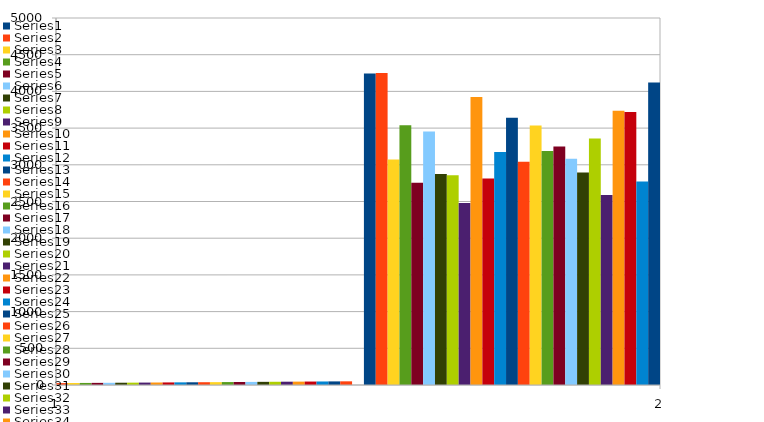
| Category | Series 0 | Series 1 | Series 2 | Series 3 | Series 4 | Series 5 | Series 6 | Series 7 | Series 8 | Series 9 | Series 10 | Series 11 | Series 12 | Series 13 | Series 14 | Series 15 | Series 16 | Series 17 | Series 18 | Series 19 | Series 20 | Series 21 | Series 22 | Series 23 | Series 24 | Series 25 | Series 26 | Series 27 | Series 28 | Series 29 | Series 30 | Series 31 | Series 32 | Series 33 | Series 34 | Series 35 | Series 36 | Series 37 | Series 38 | Series 39 | Series 40 | Series 41 | Series 42 | Series 43 | Series 44 | Series 45 | Series 46 | Series 47 | Series 48 | Series 49 |
|---|---|---|---|---|---|---|---|---|---|---|---|---|---|---|---|---|---|---|---|---|---|---|---|---|---|---|---|---|---|---|---|---|---|---|---|---|---|---|---|---|---|---|---|---|---|---|---|---|---|---|
| 0 | 1 | 2 | 3 | 4 | 5 | 6 | 7 | 8 | 9 | 10 | 11 | 12 | 13 | 14 | 15 | 16 | 17 | 18 | 19 | 20 | 21 | 22 | 23 | 24 | 25 | 26 | 27 | 28 | 29 | 30 | 31 | 32 | 33 | 34 | 35 | 36 | 37 | 38 | 39 | 40 | 41 | 42 | 43 | 44 | 45 | 46 | 47 | 48 | 49 | 50 |
| 1 | 4244 | 4252 | 3072 | 3540 | 2756 | 3452 | 2876 | 2856 | 2480 | 3924 | 2812 | 3176 | 3640 | 3040 | 3536 | 3188 | 3248 | 3084 | 2896 | 3360 | 2588 | 3736 | 3720 | 2772 | 4120 | 3156 | 3860 | 3968 | 2536 | 3752 | 3736 | 3492 | 3680 | 3444 | 3812 | 3184 | 3180 | 2848 | 3200 | 4644 | 2568 | 3828 | 2456 | 3360 | 3364 | 3568 | 3432 | 3856 | 3672 | 2948 |